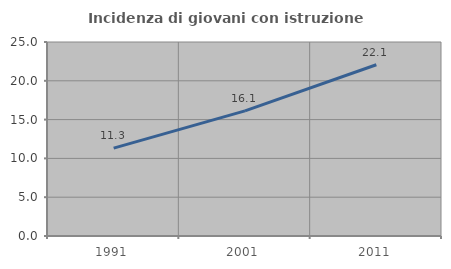
| Category | Incidenza di giovani con istruzione universitaria |
|---|---|
| 1991.0 | 11.327 |
| 2001.0 | 16.128 |
| 2011.0 | 22.065 |